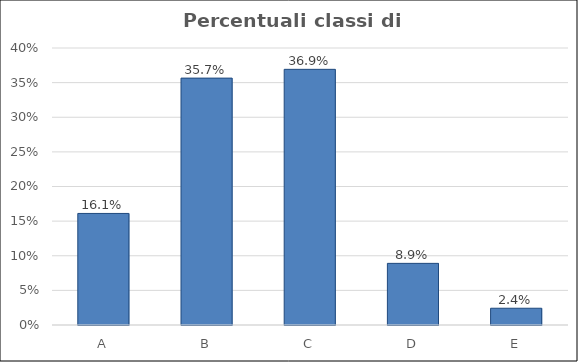
| Category | Series 0 |
|---|---|
| A | 0.161 |
| B | 0.356 |
| C | 0.369 |
| D | 0.089 |
| E | 0.024 |